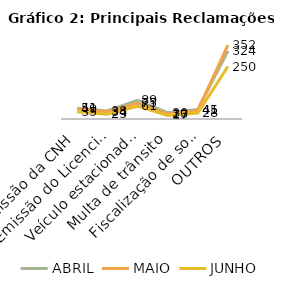
| Category | ABRIL | MAIO | JUNHO |
|---|---|---|---|
| Emissão da CNH | 51 | 49 | 35 |
| Emissão do Licenciamento CRLV | 38 | 34 | 23 |
| Veículo estacionado em local irregular | 89 | 75 | 61 |
| Multa de trânsito | 30 | 23 | 17 |
| Fiscalização de som automotivo | 45 | 41 | 28 |
| OUTROS | 324 | 352 | 250 |